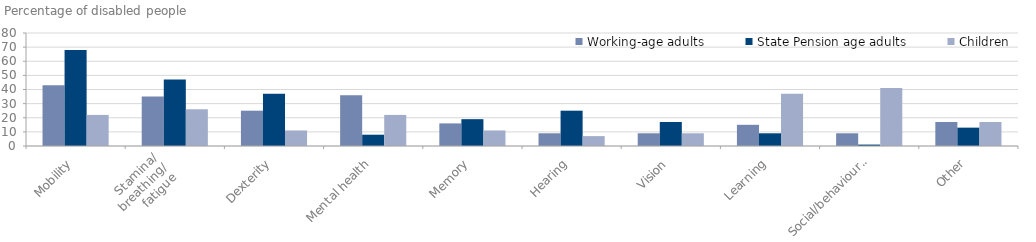
| Category | Working-age adults | State Pension age adults | Children |
|---|---|---|---|
| Mobility | 43 | 68 | 22 |
| Stamina/
breathing/
fatigue | 35 | 47 | 26 |
| Dexterity | 25 | 37 | 11 |
| Mental health | 36 | 8 | 22 |
| Memory | 16 | 19 | 11 |
| Hearing | 9 | 25 | 7 |
| Vision | 9 | 17 | 9 |
| Learning | 15 | 9 | 37 |
| Social/behavioural | 9 | 1 | 41 |
| Other | 17 | 13 | 17 |